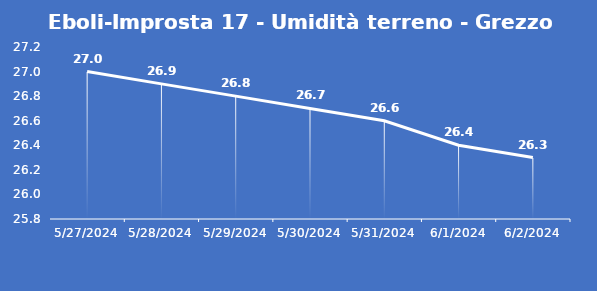
| Category | Eboli-Improsta 17 - Umidità terreno - Grezzo (%VWC) |
|---|---|
| 5/27/24 | 27 |
| 5/28/24 | 26.9 |
| 5/29/24 | 26.8 |
| 5/30/24 | 26.7 |
| 5/31/24 | 26.6 |
| 6/1/24 | 26.4 |
| 6/2/24 | 26.3 |